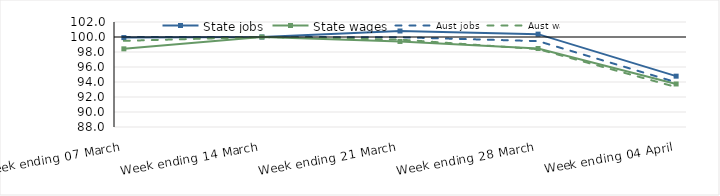
| Category | State jobs | State wages | Aust jobs | Aust wages |
|---|---|---|---|---|
| 2020-03-07 | 99.923 | 98.421 | 100.003 | 99.487 |
| 2020-03-14 | 100 | 100 | 100 | 100 |
| 2020-03-21 | 100.799 | 99.407 | 99.966 | 99.652 |
| 2020-03-28 | 100.382 | 98.466 | 99.451 | 98.382 |
| 2020-04-04 | 94.778 | 93.738 | 93.968 | 93.326 |